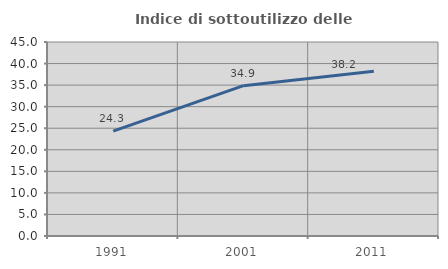
| Category | Indice di sottoutilizzo delle abitazioni  |
|---|---|
| 1991.0 | 24.34 |
| 2001.0 | 34.866 |
| 2011.0 | 38.235 |